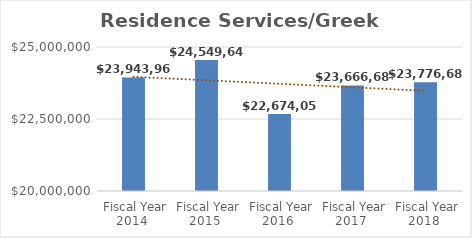
| Category | Residence Services/Greek Housing |
|---|---|
| Fiscal Year 2014 | 23943960 |
| Fiscal Year 2015 | 24549646 |
| Fiscal Year 2016 | 22674053 |
| Fiscal Year 2017 | 23666688 |
| Fiscal Year 2018 | 23776688.08 |